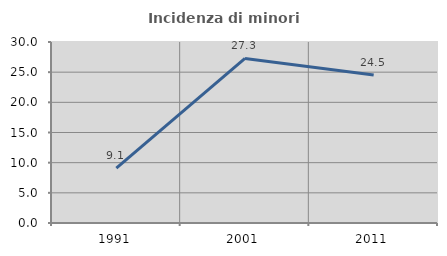
| Category | Incidenza di minori stranieri |
|---|---|
| 1991.0 | 9.091 |
| 2001.0 | 27.273 |
| 2011.0 | 24.518 |